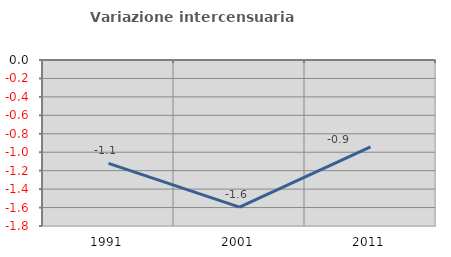
| Category | Variazione intercensuaria annua |
|---|---|
| 1991.0 | -1.121 |
| 2001.0 | -1.595 |
| 2011.0 | -0.942 |